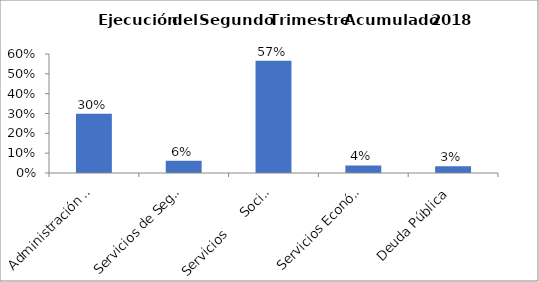
| Category | Series 0 |
|---|---|
| Administración Gubernamental | 0.299 |
| Servicios de Seguridad | 0.062 |
| Servicios      Sociales | 0.567 |
| Servicios Económicos | 0.038 |
| Deuda Pública | 0.034 |